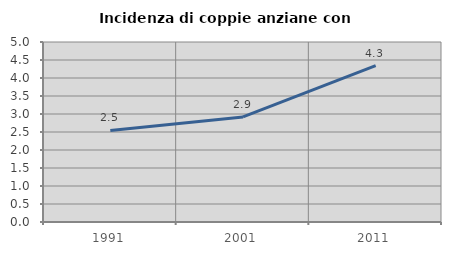
| Category | Incidenza di coppie anziane con figli |
|---|---|
| 1991.0 | 2.545 |
| 2001.0 | 2.919 |
| 2011.0 | 4.342 |